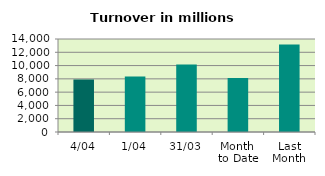
| Category | Series 0 |
|---|---|
| 4/04 | 7887.146 |
| 1/04 | 8343.837 |
| 31/03 | 10148.849 |
| Month 
to Date | 8115.491 |
| Last
Month | 13160.868 |